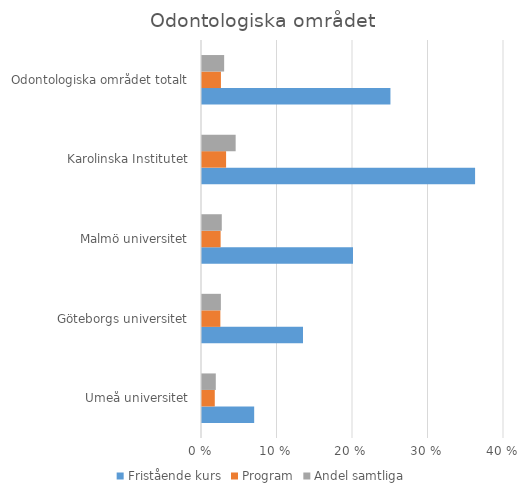
| Category | Fristående kurs | Program | Andel samtliga |
|---|---|---|---|
| Umeå universitet | 0.069 | 0.017 | 0.018 |
| Göteborgs universitet | 0.134 | 0.024 | 0.025 |
| Malmö universitet | 0.2 | 0.025 | 0.026 |
| Karolinska Institutet | 0.362 | 0.032 | 0.045 |
| Odontologiska området totalt | 0.25 | 0.025 | 0.029 |